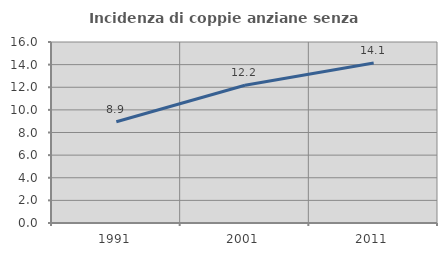
| Category | Incidenza di coppie anziane senza figli  |
|---|---|
| 1991.0 | 8.95 |
| 2001.0 | 12.173 |
| 2011.0 | 14.149 |